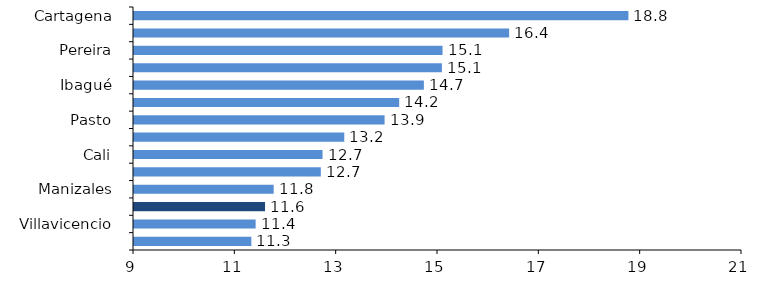
| Category | Series 0 |
|---|---|
| Cartagena | 18.758 |
| Cúcuta | 16.404 |
| Pereira | 15.089 |
| Barranquilla | 15.077 |
| Ibagué | 14.721 |
| Montería | 14.234 |
| Pasto | 13.946 |
| Bucaramanga | 13.15 |
| Cali | 12.721 |
| Total 13 áreas | 12.688 |
| Manizales | 11.757 |
| Bogotá | 11.586 |
| Villavicencio | 11.401 |
| Medellín | 11.317 |